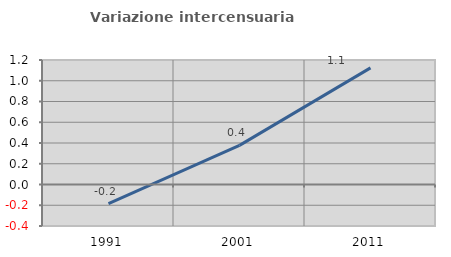
| Category | Variazione intercensuaria annua |
|---|---|
| 1991.0 | -0.183 |
| 2001.0 | 0.377 |
| 2011.0 | 1.124 |